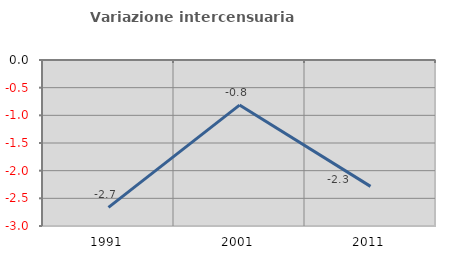
| Category | Variazione intercensuaria annua |
|---|---|
| 1991.0 | -2.664 |
| 2001.0 | -0.814 |
| 2011.0 | -2.284 |